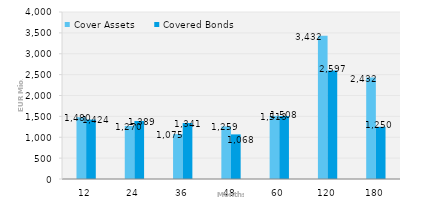
| Category | Cover Assets | Covered Bonds |
|---|---|---|
| 12.0 | 1480.443 | 1423.942 |
| 24.0 | 1270.164 | 1388.685 |
| 36.0 | 1075.264 | 1340.613 |
| 48.0 | 1258.552 | 1068.408 |
| 60.0 | 1512.917 | 1507.5 |
| 120.0 | 3431.651 | 2597.285 |
| 180.0 | 2431.791 | 1250.202 |